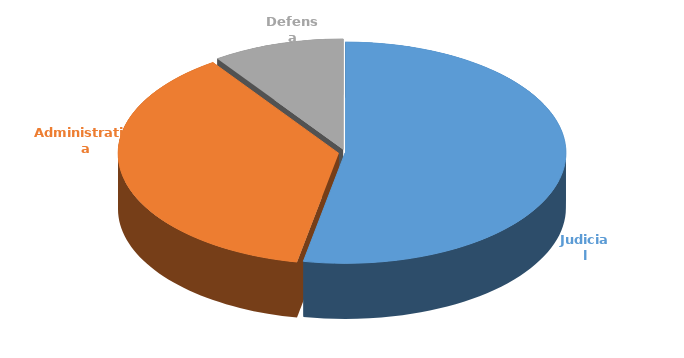
| Category | Cantidad |
|---|---|
| Judicial | 324 |
| Administrativa | 228 |
| Defensa | 59 |